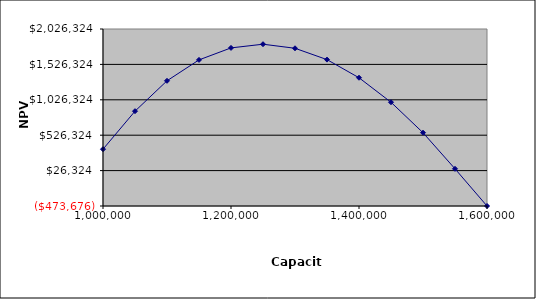
| Category | NPV (E20) |
|---|---|
| 1000000.0 | 328561.604 |
| 1050000.0 | 865525.841 |
| 1100000.0 | 1294882.739 |
| 1150000.0 | 1589847.925 |
| 1200000.0 | 1759303.988 |
| 1250000.0 | 1811484.346 |
| 1300000.0 | 1754017.864 |
| 1350000.0 | 1593970.728 |
| 1400000.0 | 1337885.706 |
| 1450000.0 | 991818.91 |
| 1500000.0 | 561374.213 |
| 1550000.0 | 51735.419 |
| 1600000.0 | -473675.6 |